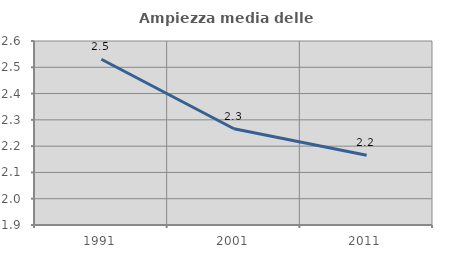
| Category | Ampiezza media delle famiglie |
|---|---|
| 1991.0 | 2.531 |
| 2001.0 | 2.266 |
| 2011.0 | 2.165 |